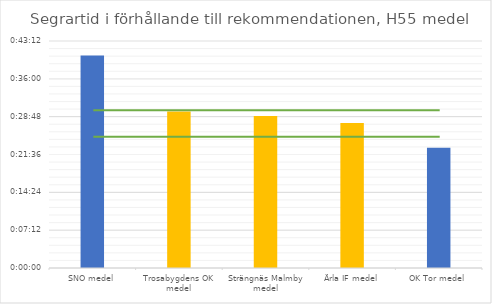
| Category | H55 tid |
|---|---|
| SNO medel | 0.028 |
| Trosabygdens OK medel | 0.021 |
| Strängnäs Malmby medel | 0.02 |
| Ärla IF medel | 0.019 |
| OK Tor medel | 0.016 |